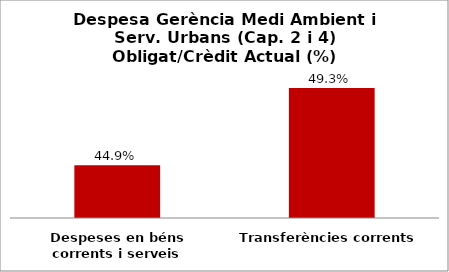
| Category | Series 0 |
|---|---|
| Despeses en béns corrents i serveis | 0.449 |
| Transferències corrents | 0.493 |